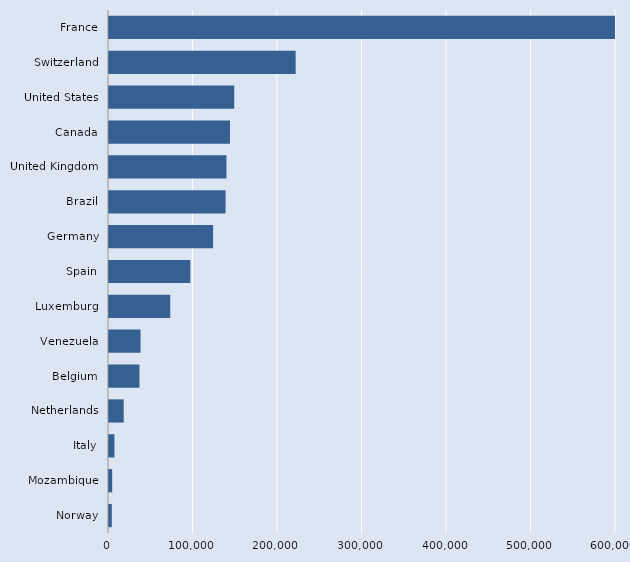
| Category | Series 0 |
|---|---|
| Norway | 3320 |
| Mozambique | 3767 |
| Italy | 6461 |
| Netherlands | 17384 |
| Belgium | 36074 |
| Venezuela | 37326 |
| Luxemburg | 72477 |
| Spain | 96266 |
| Germany | 123155 |
| Brazil | 137973 |
| United Kingdom | 139000 |
| Canada | 143160 |
| United States | 148208 |
| Switzerland | 220904 |
| France | 621777 |